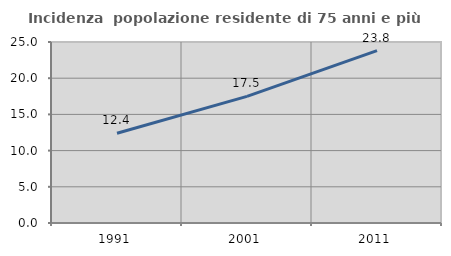
| Category | Incidenza  popolazione residente di 75 anni e più |
|---|---|
| 1991.0 | 12.4 |
| 2001.0 | 17.49 |
| 2011.0 | 23.81 |